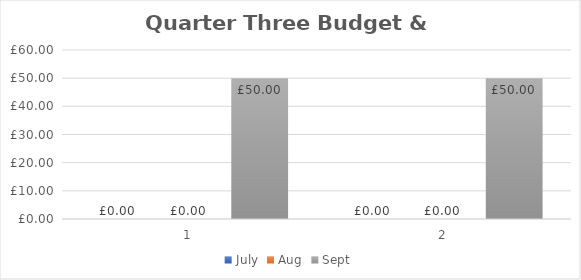
| Category | July | Aug | Sept |
|---|---|---|---|
| 0 | 0 | 0 | 50 |
| 1 | 0 | 0 | 50 |